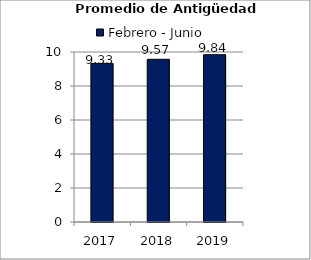
| Category | Febrero - Junio |
|---|---|
| 2017.0 | 9.33 |
| 2018.0 | 9.57 |
| 2019.0 | 9.84 |